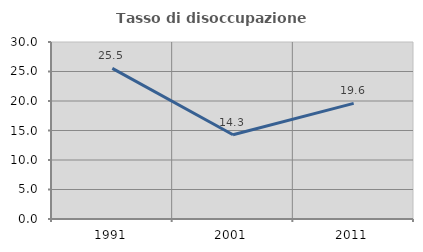
| Category | Tasso di disoccupazione giovanile  |
|---|---|
| 1991.0 | 25.535 |
| 2001.0 | 14.286 |
| 2011.0 | 19.591 |